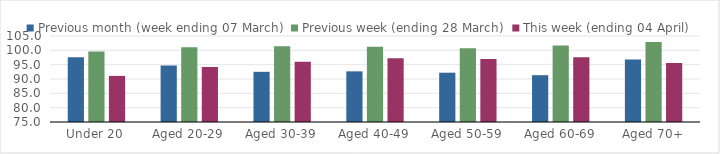
| Category | Previous month (week ending 07 March) | Previous week (ending 28 March) | This week (ending 04 April) |
|---|---|---|---|
| Under 20 | 97.582 | 99.624 | 91.08 |
| Aged 20-29 | 94.696 | 101.063 | 94.165 |
| Aged 30-39 | 92.503 | 101.408 | 96.026 |
| Aged 40-49 | 92.67 | 101.252 | 97.197 |
| Aged 50-59 | 92.2 | 100.748 | 96.973 |
| Aged 60-69 | 91.333 | 101.722 | 97.6 |
| Aged 70+ | 96.764 | 102.925 | 95.582 |